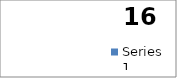
| Category | Series 0 |
|---|---|
| А | 104 |
| Б | 8 |
| В | 52 |